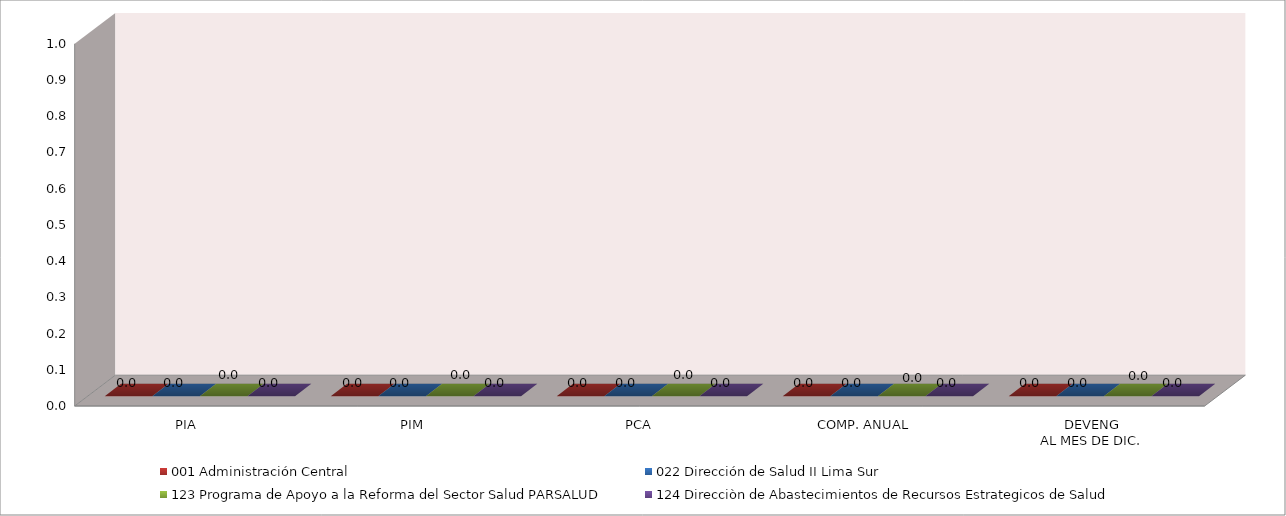
| Category | 001 Administración Central | 022 Dirección de Salud II Lima Sur | 123 Programa de Apoyo a la Reforma del Sector Salud PARSALUD | 124 Direcciòn de Abastecimientos de Recursos Estrategicos de Salud |
|---|---|---|---|---|
| PIA | 0 | 0 | 0 | 0 |
| PIM | 0 | 0 | 0 | 0 |
| PCA | 0 | 0 | 0 | 0 |
| COMP. ANUAL | 0 | 0 | 0 | 0 |
| DEVENG
AL MES DE DIC. | 0 | 0 | 0 | 0 |